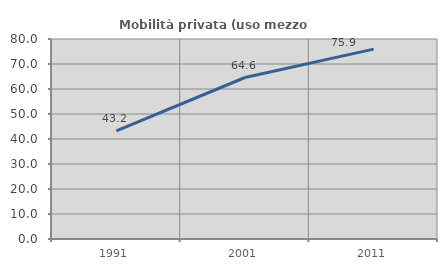
| Category | Mobilità privata (uso mezzo privato) |
|---|---|
| 1991.0 | 43.24 |
| 2001.0 | 64.596 |
| 2011.0 | 75.941 |